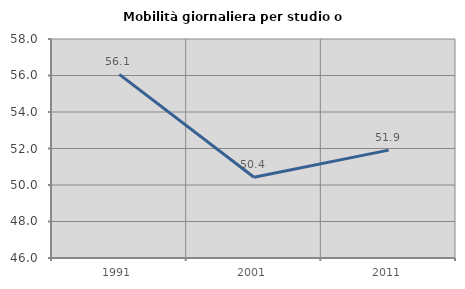
| Category | Mobilità giornaliera per studio o lavoro |
|---|---|
| 1991.0 | 56.062 |
| 2001.0 | 50.425 |
| 2011.0 | 51.911 |